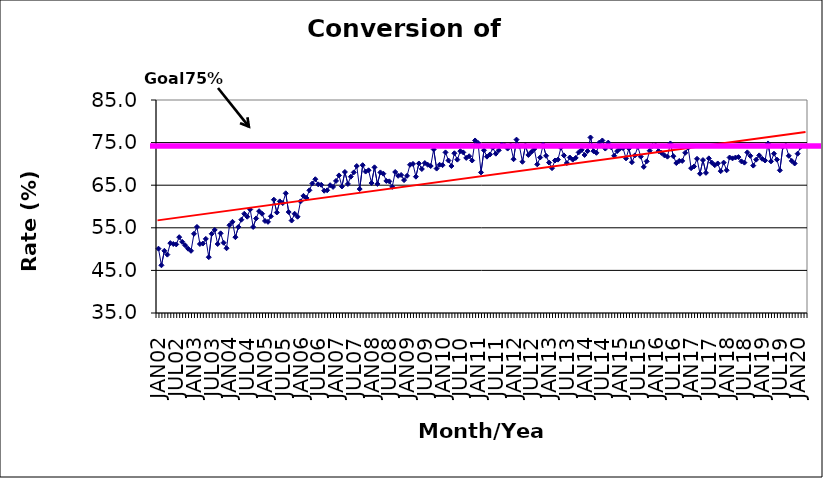
| Category | Series 0 |
|---|---|
| JAN02 | 50.1 |
| FEB02 | 46.2 |
| MAR02 | 49.6 |
| APR02 | 48.7 |
| MAY02 | 51.4 |
| JUN02 | 51.2 |
| JUL02 | 51.1 |
| AUG02 | 52.8 |
| SEP02 | 51.7 |
| OCT02 | 50.9 |
| NOV02 | 50.1 |
| DEC02 | 49.6 |
| JAN03 | 53.6 |
| FEB03 | 55.2 |
| MAR03 | 51.2 |
| APR03 | 51.3 |
| MAY03 | 52.4 |
| JUN03 | 48.1 |
| JUL03 | 53.6 |
| AUG03 | 54.5 |
| SEP03 | 51.2 |
| OCT03 | 53.7 |
| NOV03 | 51.5 |
| DEC03 | 50.2 |
| JAN04 | 55.6 |
| FEB04 | 56.4 |
| MAR04 | 52.8 |
| APR04 | 55.2 |
| MAY04 | 56.9 |
| JUN04 | 58.3 |
| JUL04 | 57.6 |
| AUG04 | 59.3 |
| SEP04 | 55.2 |
| OCT04 | 57.2 |
| NOV04 | 58.9 |
| DEC04 | 58.3 |
| JAN05 | 56.6 |
| FEB05 | 56.4 |
| MAR05 | 57.7 |
| APR05 | 61.6 |
| MAY05 | 58.6 |
| JUN05 | 61.2 |
| JUL05 | 60.8 |
| AUG05 | 63.1 |
| SEP05 | 58.7 |
| OCT05 | 56.7 |
| NOV05 | 58.3 |
| DEC05 | 57.6 |
| JAN06 | 61.2 |
| FEB06 | 62.5 |
| MAR06 | 62 |
| APR06 | 63.8 |
| MAY06 | 65.4 |
| JUN06 | 66.4 |
| JUL06 | 65.2 |
| AUG06 | 65.1 |
| SEP06 | 63.7 |
| OCT06 | 63.8 |
| NOV06 | 65 |
| DEC06 | 64.6 |
| JAN07 | 66 |
| FEB07 | 67.3 |
| MAR07 | 64.7 |
| APR07 | 68.1 |
| MAY07 | 65.3 |
| JUN07 | 67 |
| JUL07 | 68 |
| AUG07 | 69.5 |
| SEP07 | 64.1 |
| OCT07 | 69.7 |
| NOV07 | 68.2 |
| DEC07 | 68.5 |
| JAN08 | 65.5 |
| FEB08 | 69.2 |
| MAR08 | 65.3 |
| APR08 | 68 |
| MAY08 | 67.7 |
| JUN08 | 66 |
| JUL08 | 65.9 |
| AUG08 | 64.6 |
| SEP08 | 68.1 |
| OCT08 | 67.2 |
| NOV08 | 67.4 |
| DEC08 | 66.2 |
| JAN09 | 67.2 |
| FEB09 | 69.8 |
| MAR09 | 70 |
| APR09 | 67 |
| MAY09 | 70.1 |
| JUN09 | 68.8 |
| JUL09 | 70.2 |
| AUG09 | 69.8 |
| SEP09 | 69.5 |
| OCT09 | 73.4 |
| NOV09 | 68.9 |
| DEC09 | 69.8 |
| JAN10 | 69.7 |
| FEB10 | 72.7 |
| MAR10 | 70.8 |
| APR10 | 69.5 |
| MAY10 | 72.5 |
| JUN10 | 71 |
| JUL10 | 73 |
| AUG10 | 72.7 |
| SEP10 | 71.4 |
| OCT10 | 71.8 |
| NOV10 | 70.8 |
| DEC10 | 75.5 |
| JAN11 | 74.9 |
| FEB11 | 68 |
| MAR11 | 73.2 |
| APR11 | 71.7 |
| MAY11 | 72.2 |
| JUN11 | 73.8 |
| JUL11 | 72.4 |
| AUG11 | 73.2 |
| SEP11 | 74.5 |
| OCT11 | 74.3 |
| NOV11 | 73.6 |
| DEC11 | 74.3 |
| JAN12 | 71.1 |
| FEB12 | 75.7 |
| MAR12 | 74.1 |
| APR12 | 70.5 |
| MAY12 | 74.3 |
| JUN12 | 72.1 |
| JUL12 | 72.8 |
| AUG12 | 73.5 |
| SEP12 | 69.9 |
| OCT12 | 71.5 |
| NOV12 | 74.5 |
| DEC12 | 71.9 |
| JAN13 | 70.3 |
| FEB13 | 69 |
| MAR13 | 70.8 |
| APR13 | 71 |
| MAY13 | 73.8 |
| JUN13 | 72 |
| JUL13 | 70.2 |
| AUG13 | 71.5 |
| SEP13 | 71 |
| OCT13 | 71.4 |
| NOV13 | 72.7 |
| DEC13 | 73.3 |
| JAN14 | 72.1 |
| FEB14 | 73 |
| MAR14 | 76.2 |
| APR14 | 73 |
| MAY14 | 72.6 |
| JUN14 | 75 |
| JUL14 | 75.5 |
| AUG14 | 73.6 |
| SEP14 | 75 |
| OCT14 | 73.9 |
| NOV14 | 71.9 |
| DEC14 | 73 |
| JAN15 | 73.6 |
| FEB15 | 73.7 |
| MAR15 | 71.3 |
| APR15 | 73.6 |
| MAY15 | 70.4 |
| JUN15 | 72 |
| JUL15 | 74 |
| AUG15 | 71.7 |
| SEP15 | 69.3 |
| OCT15 | 70.6 |
| NOV15 | 73.1 |
| DEC15 | 74.2 |
| JAN16 | 74.3 |
| FEB16 | 73 |
| MAR16 | 72.6 |
| APR16 | 72 |
| MAY16 | 71.7 |
| JUN16 | 74.8 |
| JUL16 | 71.8 |
| AUG16 | 70.2 |
| SEP16 | 70.7 |
| OCT16 | 70.7 |
| NOV16 | 72.6 |
| DEC16 | 73.8 |
| JAN17 | 69 |
| FEB17 | 69.4 |
| MAR17 | 71.2 |
| APR17 | 67.7 |
| MAY17 | 70.9 |
| JUN17 | 67.9 |
| JUL17 | 71.3 |
| AUG17 | 70.3 |
| SEP17 | 69.7 |
| OCT17 | 70.1 |
| NOV17 | 68.3 |
| DEC17 | 70.3 |
| JAN18 | 68.5 |
| FEB18 | 71.5 |
| MAR18 | 71.3 |
| APR18 | 71.5 |
| MAY18 | 71.6 |
| JUN18 | 70.6 |
| JUL18 | 70.3 |
| AUG18 | 72.7 |
| SEP18 | 71.9 |
| OCT18 | 69.6 |
| NOV18 | 71 |
| DEC18 | 72 |
| JAN19 | 71.2 |
| FEB19 | 70.8 |
| MAR19 | 74.8 |
| APR19 | 70.6 |
| MAY19 | 72.4 |
| JUN19 | 71 |
| JUL19 | 68.5 |
| AUG19 | 74 |
| SEP19 | 74.3 |
| OCT19 | 71.9 |
| NOV19 | 70.7 |
| DEC19 | 70.1 |
| JAN20 | 72.4 |
| FEB20 | 74 |